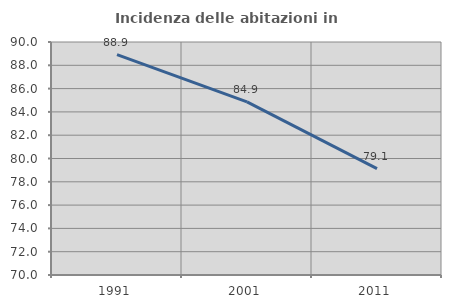
| Category | Incidenza delle abitazioni in proprietà  |
|---|---|
| 1991.0 | 88.915 |
| 2001.0 | 84.867 |
| 2011.0 | 79.13 |